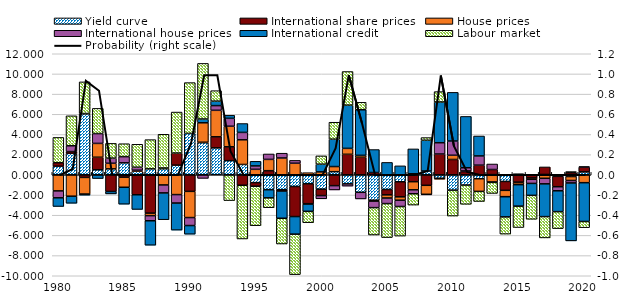
| Category | Yield curve | International share prices | House prices | International house prices | International credit | Labour market |
|---|---|---|---|---|---|---|
| 1980.0 | 0.859 | 0.342 | -1.592 | -0.685 | -0.858 | 2.508 |
| 1981.0 | 2.131 | 0.176 | -2.117 | 0.573 | -0.699 | 2.97 |
| 1982.0 | 6.051 | -0.254 | -1.652 | 0.028 | -0.109 | 3.134 |
| 1983.0 | 0.501 | 1.245 | 1.371 | 0.973 | -0.366 | 2.498 |
| 1984.0 | 0.593 | -1.647 | 0.555 | 0.509 | -0.241 | 1.462 |
| 1985.0 | 1.19 | -0.231 | -1 | 0.614 | -1.677 | 1.28 |
| 1986.0 | 0.36 | -1.974 | 0.099 | 0.299 | -1.453 | 2.272 |
| 1987.0 | 0.591 | -3.795 | -0.249 | -0.506 | -2.422 | 2.9 |
| 1988.0 | 0.603 | 0.074 | -1.003 | -0.789 | -2.654 | 3.343 |
| 1989.0 | 0.962 | 1.198 | -1.956 | -0.839 | -2.68 | 4.063 |
| 1990.0 | 4.103 | -1.638 | -2.594 | -0.791 | -0.856 | 5.04 |
| 1991.0 | 3.188 | 0.043 | 1.928 | -0.351 | 0.378 | 5.508 |
| 1992.0 | 2.674 | 1.098 | 2.624 | 0.466 | 0.444 | 1.036 |
| 1993.0 | 1.408 | 1.372 | 2.038 | 0.783 | 0.299 | -2.55 |
| 1994.0 | 1.027 | -1.03 | 2.447 | 0.732 | 0.879 | -5.324 |
| 1995.0 | -0.771 | -0.356 | 0.549 | 0.336 | 0.457 | -3.913 |
| 1996.0 | -1.472 | 0.412 | 1.12 | 0.537 | -0.811 | -0.974 |
| 1997.0 | -1.482 | -0.121 | 1.671 | 0.474 | -2.699 | -2.552 |
| 1998.0 | -1.153 | -2.981 | 1.153 | 0.281 | -1.743 | -4.013 |
| 1999.0 | -0.886 | -1.971 | 0.215 | -0.041 | -0.717 | -1.127 |
| 2000.0 | -1.417 | -0.638 | 0.295 | -0.32 | 0.765 | 0.819 |
| 2001.0 | 0.312 | -1.07 | 0.509 | -0.425 | 2.71 | 1.684 |
| 2002.0 | -0.895 | 2.035 | 0.589 | -0.222 | 4.282 | 3.334 |
| 2003.0 | -1.731 | 1.739 | 0.194 | -0.655 | 4.518 | 0.739 |
| 2004.0 | -2.511 | 0.23 | -0.094 | -0.645 | 2.278 | -2.714 |
| 2005.0 | -1.452 | -0.534 | -0.311 | -0.552 | 1.231 | -3.368 |
| 2006.0 | -0.685 | -1.497 | -0.33 | -0.624 | 0.892 | -2.931 |
| 2007.0 | 0.108 | -0.679 | -0.805 | -0.389 | 2.463 | -1.126 |
| 2008.0 | 0.377 | -1.036 | -0.891 | -0.054 | 3.055 | 0.262 |
| 2009.0 | -0.333 | 2.064 | -0.103 | 1.118 | 4.038 | 1.029 |
| 2010.0 | -1.514 | 1.523 | 0.419 | 1.412 | 4.822 | -2.569 |
| 2011.0 | -1.013 | 0.318 | 0.07 | 0.318 | 5.084 | -1.907 |
| 2012.0 | -0.382 | 0.959 | -1.256 | 0.915 | 1.976 | -1.001 |
| 2013.0 | 0.026 | 0.502 | -0.713 | 0.547 | -0.034 | -1.098 |
| 2014.0 | -0.653 | -0.882 | -0.631 | -0.002 | -2.002 | -1.704 |
| 2015.0 | 0.115 | -0.725 | -0.218 | -0.03 | -2.129 | -2.117 |
| 2016.0 | -0.008 | -0.305 | -0.127 | -0.409 | -1.185 | -2.369 |
| 2017.0 | 0.04 | 0.744 | -0.342 | -0.552 | -3.247 | -2.111 |
| 2018.0 | -0.149 | -1.029 | 0.025 | -0.403 | -2.063 | -1.685 |
| 2019.0 | -0.17 | 0.215 | -0.388 | -0.249 | -5.735 | 0.109 |
| 2020.0 | 0.292 | 0.475 | -0.777 | 0.043 | -3.844 | -0.614 |